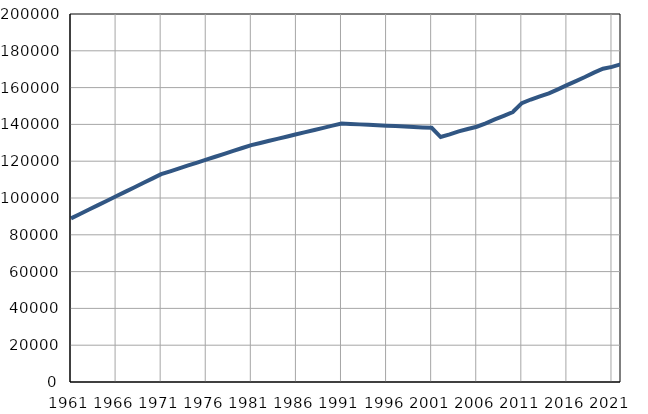
| Category | Population
size |
|---|---|
| 1961.0 | 88919 |
| 1962.0 | 91321 |
| 1963.0 | 93723 |
| 1964.0 | 96125 |
| 1965.0 | 98527 |
| 1966.0 | 100928 |
| 1967.0 | 103330 |
| 1968.0 | 105732 |
| 1969.0 | 108134 |
| 1970.0 | 110536 |
| 1971.0 | 112938 |
| 1972.0 | 114520 |
| 1973.0 | 116100 |
| 1974.0 | 117683 |
| 1975.0 | 119264 |
| 1976.0 | 120845 |
| 1977.0 | 122427 |
| 1978.0 | 124009 |
| 1979.0 | 125590 |
| 1980.0 | 127172 |
| 1981.0 | 128753 |
| 1982.0 | 129926 |
| 1983.0 | 131099 |
| 1984.0 | 132272 |
| 1985.0 | 133444 |
| 1986.0 | 134618 |
| 1987.0 | 135792 |
| 1988.0 | 136964 |
| 1989.0 | 138137 |
| 1990.0 | 139310 |
| 1991.0 | 140483 |
| 1992.0 | 140248 |
| 1993.0 | 140014 |
| 1994.0 | 139779 |
| 1995.0 | 139545 |
| 1996.0 | 139311 |
| 1997.0 | 139076 |
| 1998.0 | 138841 |
| 1999.0 | 138607 |
| 2000.0 | 138372 |
| 2001.0 | 138138 |
| 2002.0 | 133136 |
| 2003.0 | 134589 |
| 2004.0 | 136233 |
| 2005.0 | 137523 |
| 2006.0 | 138727 |
| 2007.0 | 140559 |
| 2008.0 | 142690 |
| 2009.0 | 144652 |
| 2010.0 | 146718 |
| 2011.0 | 151540 |
| 2012.0 | 153522 |
| 2013.0 | 155206 |
| 2014.0 | 156872 |
| 2015.0 | 159026 |
| 2016.0 | 161340 |
| 2017.0 | 163542 |
| 2018.0 | 165739 |
| 2019.0 | 168118 |
| 2020.0 | 170228 |
| 2021.0 | 171278 |
| 2022.0 | 172719 |